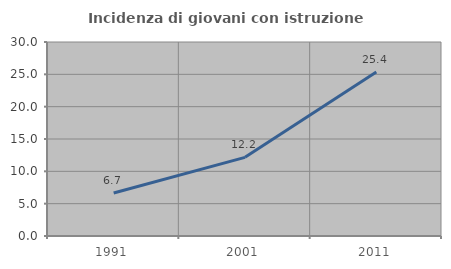
| Category | Incidenza di giovani con istruzione universitaria |
|---|---|
| 1991.0 | 6.658 |
| 2001.0 | 12.161 |
| 2011.0 | 25.351 |